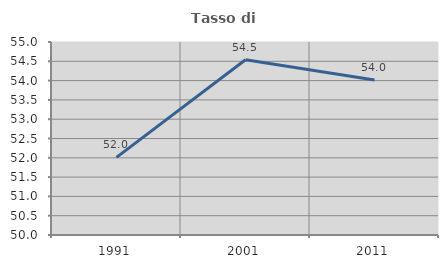
| Category | Tasso di occupazione   |
|---|---|
| 1991.0 | 52.01 |
| 2001.0 | 54.541 |
| 2011.0 | 54.013 |